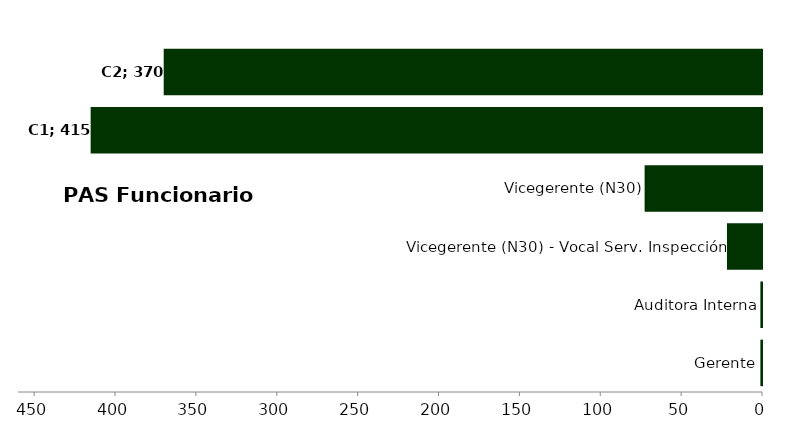
| Category | Series 3 |
|---|---|
| Gerente* | 1 |
| Auditora Interna | 1 |
| A1 | 21.667 |
| A2 | 72.583 |
| C1 | 415.083 |
| C2 | 369.917 |